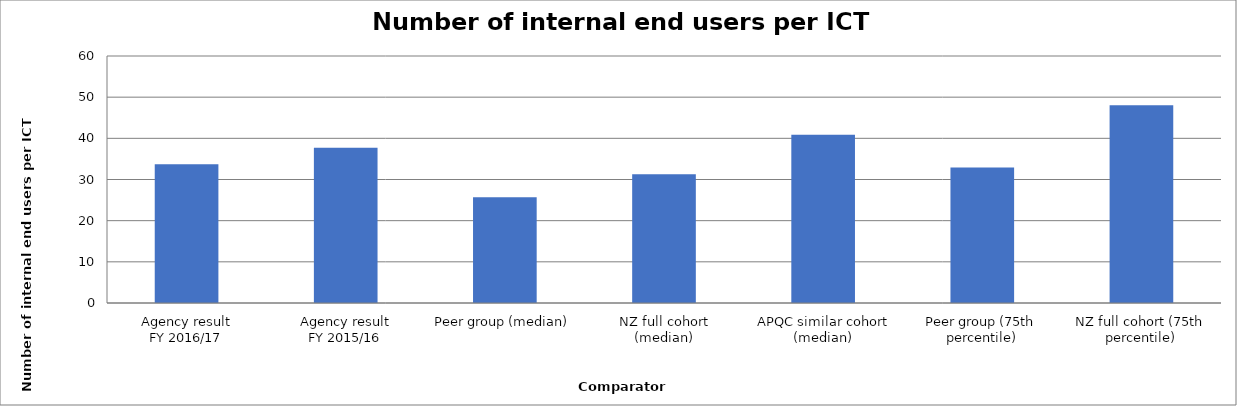
| Category | Result |
|---|---|
| Agency result
FY 2016/17 | 33.682 |
| Agency result
FY 2015/16 | 37.695 |
| Peer group (median) | 25.714 |
| NZ full cohort (median) | 31.263 |
| APQC similar cohort (median) | 40.87 |
| Peer group (75th percentile) | 32.893 |
| NZ full cohort (75th percentile) | 48.014 |